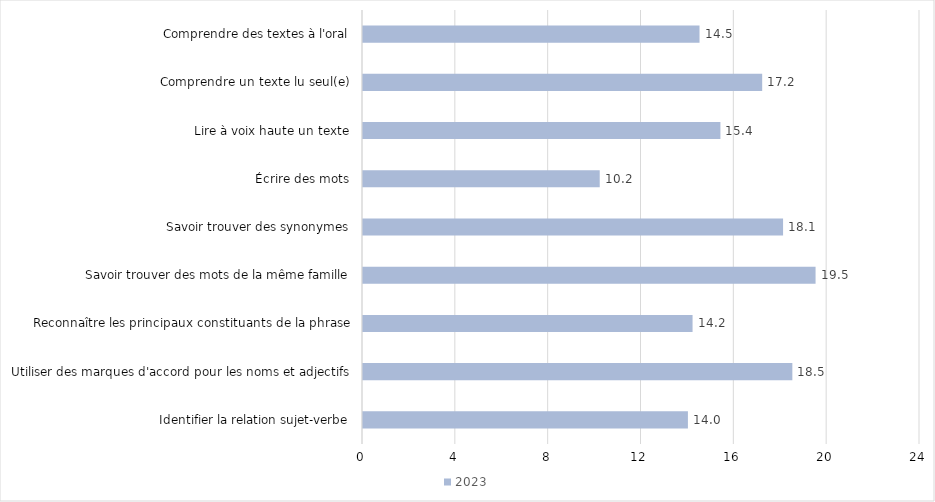
| Category | 2023 |
|---|---|
| Identifier la relation sujet-verbe | 14 |
| Utiliser des marques d'accord pour les noms et adjectifs | 18.5 |
| Reconnaître les principaux constituants de la phrase | 14.2 |
| Savoir trouver des mots de la même famille | 19.5 |
| Savoir trouver des synonymes | 18.1 |
| Écrire des mots | 10.2 |
| Lire à voix haute un texte | 15.4 |
| Comprendre un texte lu seul(e) | 17.2 |
| Comprendre des textes à l'oral | 14.5 |